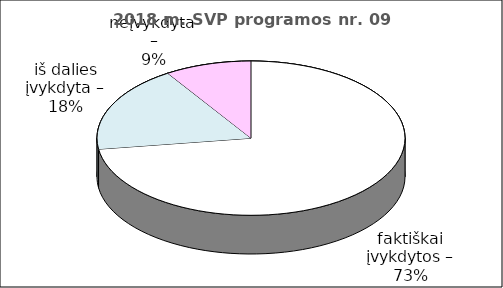
| Category | Series 0 |
|---|---|
| faktiškai įvykdytos – | 8 |
| iš dalies įvykdyta – | 2 |
| neįvykdyta – | 1 |